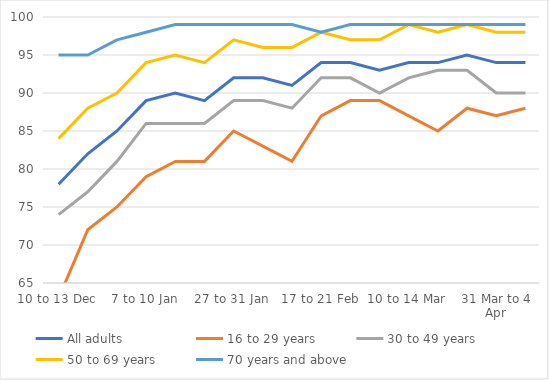
| Category | All adults | 16 to 29 years | 30 to 49 years | 50 to 69 years | 70 years and above |
|---|---|---|---|---|---|
| 10 to 13 Dec | 78 | 63 | 74 | 84 | 95 |
| 16 to 20 Dec | 82 | 72 | 77 | 88 | 95 |
| 22 Dec '20 to 3 Jan '21 | 85 | 75 | 81 | 90 | 97 |
| 7 to 10 Jan | 89 | 79 | 86 | 94 | 98 |
| 13 to 17 Jan | 90 | 81 | 86 | 95 | 99 |
| 20 to 24 Jan | 89 | 81 | 86 | 94 | 99 |
| 27 to 31 Jan | 92 | 85 | 89 | 97 | 99 |
| 3 to 7 Feb | 92 | 83 | 89 | 96 | 99 |
| 10 to 14 Feb | 91 | 81 | 88 | 96 | 99 |
| 17 to 21 Feb | 94 | 87 | 92 | 98 | 98 |
| 24 to 28 Feb | 94 | 89 | 92 | 97 | 99 |
| 3 to 7 Mar | 93 | 89 | 90 | 97 | 99 |
| 10 to 14 Mar | 94 | 87 | 92 | 99 | 99 |
| 17 to 21 Mar | 94 | 85 | 93 | 98 | 99 |
| 24 to 28 Mar | 95 | 88 | 93 | 99 | 99 |
| 31 Mar to 4 Apr | 94 | 87 | 90 | 98 | 99 |
| 7 to 11 Apr | 94 | 88 | 90 | 98 | 99 |